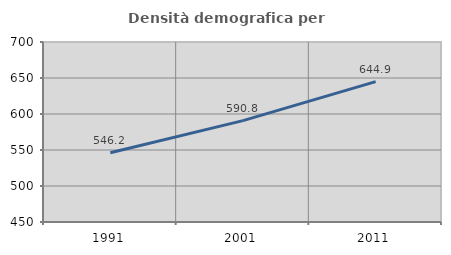
| Category | Densità demografica |
|---|---|
| 1991.0 | 546.206 |
| 2001.0 | 590.808 |
| 2011.0 | 644.948 |